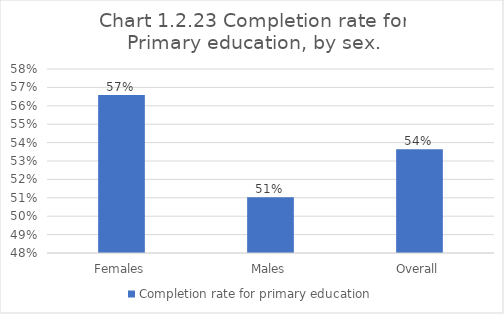
| Category | Completion rate for primary education |
|---|---|
| Females | 0.566 |
| Males | 0.51 |
| Overall | 0.536 |